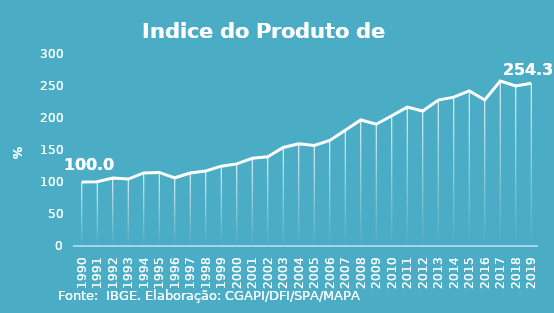
| Category | Indice de Prod. base 1990 |
|---|---|
| 1990.0 | 100 |
| 1991.0 | 100.275 |
| 1992.0 | 106.203 |
| 1993.0 | 104.57 |
| 1994.0 | 114.164 |
| 1995.0 | 115.024 |
| 1996.0 | 106.552 |
| 1997.0 | 114.037 |
| 1998.0 | 117.319 |
| 1999.0 | 124.734 |
| 2000.0 | 128.293 |
| 2001.0 | 136.975 |
| 2002.0 | 139.51 |
| 2003.0 | 153.868 |
| 2004.0 | 159.641 |
| 2005.0 | 157.136 |
| 2006.0 | 164.858 |
| 2007.0 | 180.781 |
| 2008.0 | 196.91 |
| 2009.0 | 190.309 |
| 2010.0 | 203.581 |
| 2011.0 | 217.041 |
| 2012.0 | 210.932 |
| 2013.0 | 228.009 |
| 2014.0 | 232.562 |
| 2015.0 | 242.318 |
| 2016.0 | 228.239 |
| 2017.0 | 257.766 |
| 2018.0 | 250.124 |
| 2019.0 | 254.318 |